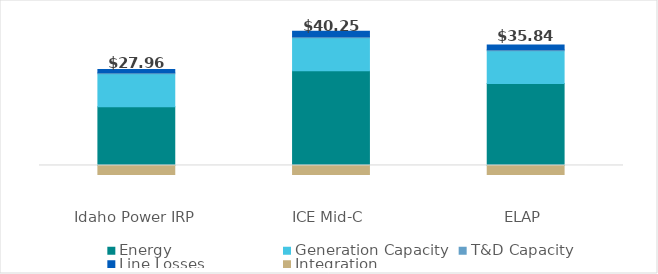
| Category | Energy | Generation Capacity | T&D Capacity | Line Losses | Integration |
|---|---|---|---|---|---|
| 0 | 18.933 | 10.603 | 0.307 | 1.098 | -2.93 |
| 1 | 30.541 | 10.603 | 0.307 | 1.771 | -2.93 |
| 2 | 26.375 | 10.603 | 0.307 | 1.53 | -2.93 |